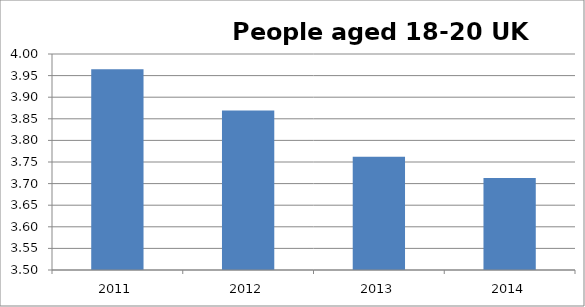
| Category | Series 0 |
|---|---|
| 2011 | 3.965 |
| 2012 | 3.869 |
| 2013 | 3.762 |
| 2014 | 3.713 |